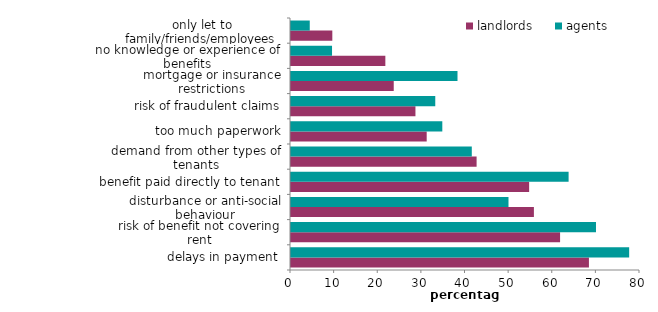
| Category | landlords | agents |
|---|---|---|
| delays in payment | 68.294 | 77.517 |
| risk of benefit not covering rent | 61.681 | 69.912 |
| disturbance or anti-social behaviour | 55.68 | 49.855 |
| benefit paid directly to tenant | 54.589 | 63.634 |
| demand from other types of tenants | 42.546 | 41.442 |
| too much paperwork | 31.106 | 34.684 |
| risk of fraudulent claims | 28.526 | 33.07 |
| mortgage or insurance restrictions | 23.55 | 38.165 |
| no knowledge or experience of benefits | 21.627 | 9.406 |
| only let to family/friends/employees  | 9.472 | 4.299 |